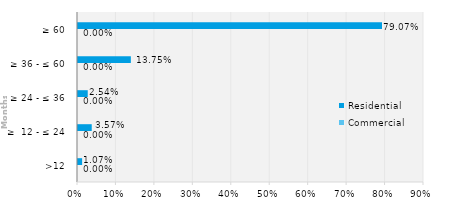
| Category | Commercial | Residential |
|---|---|---|
| >12 | 0 | 0.011 |
| ≥  12 - ≤ 24 | 0 | 0.036 |
| ≥ 24 - ≤ 36 | 0 | 0.025 |
| ≥ 36 - ≤ 60 | 0 | 0.137 |
| ≥ 60 | 0 | 0.791 |